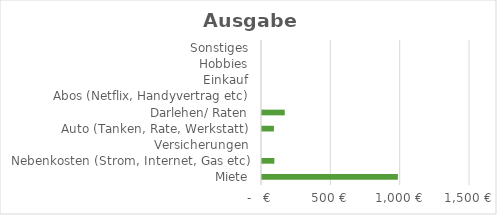
| Category | Series 0 |
|---|---|
| Miete | 980 |
| Nebenkosten (Strom, Internet, Gas etc) | 89 |
| Versicherungen | 0 |
| Auto (Tanken, Rate, Werkstatt) | 86 |
| Darlehen/ Raten | 164 |
| Abos (Netflix, Handyvertrag etc) | 0 |
| Einkauf | 0 |
| Hobbies | 0 |
| Sonstiges | 0 |